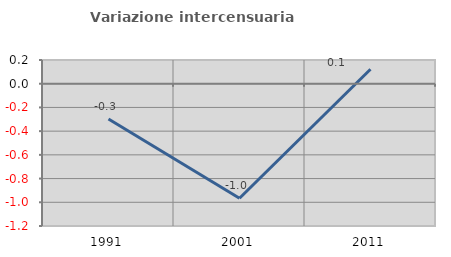
| Category | Variazione intercensuaria annua |
|---|---|
| 1991.0 | -0.298 |
| 2001.0 | -0.966 |
| 2011.0 | 0.122 |